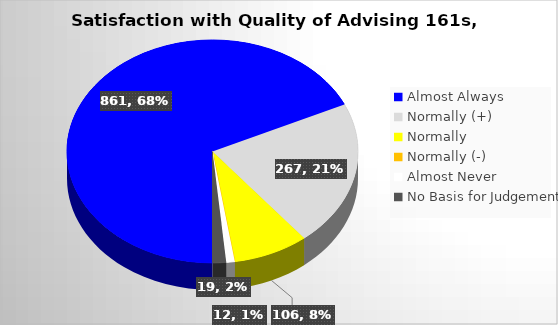
| Category | Series 0 |
|---|---|
| Almost Always | 861 |
| Normally (+) | 267 |
| Normally  | 106 |
| Normally (-) | 0 |
| Almost Never | 12 |
| No Basis for Judgement | 19 |